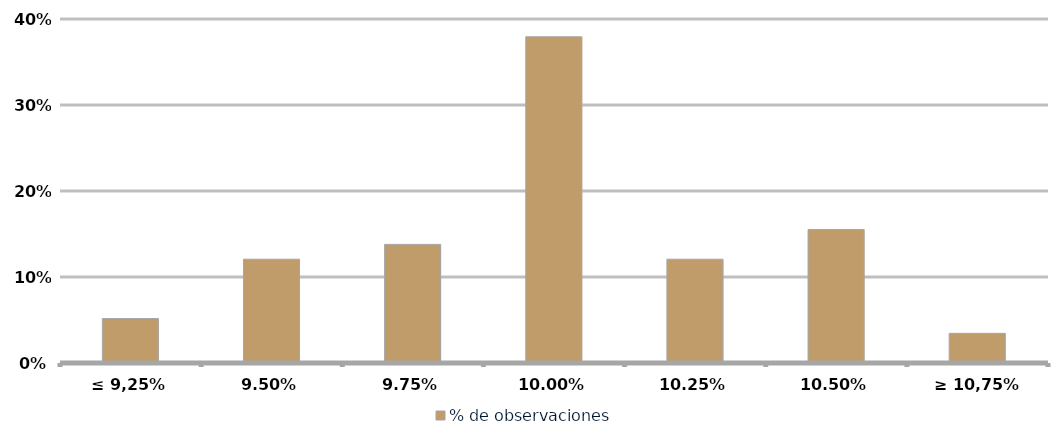
| Category | % de observaciones  |
|---|---|
| ≤ 9,25% | 0.052 |
| 9,50% | 0.121 |
| 9,75% | 0.138 |
| 10,00% | 0.379 |
| 10,25% | 0.121 |
| 10,50% | 0.155 |
| ≥ 10,75% | 0.034 |